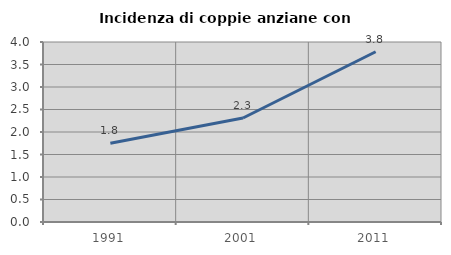
| Category | Incidenza di coppie anziane con figli |
|---|---|
| 1991.0 | 1.751 |
| 2001.0 | 2.311 |
| 2011.0 | 3.783 |